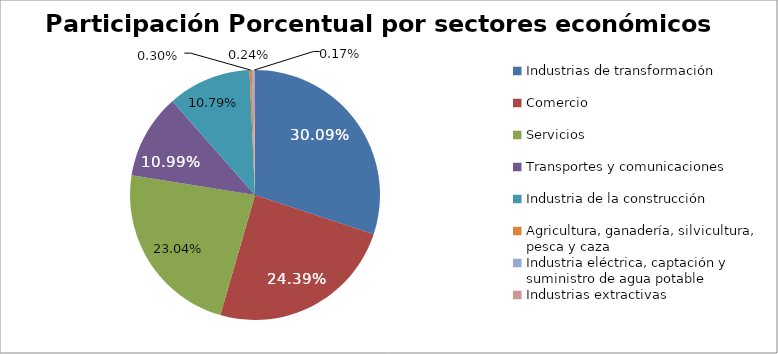
| Category | Series 0 |
|---|---|
| Industrias de transformación | 32840 |
| Comercio | 26617 |
| Servicios | 25151 |
| Transportes y comunicaciones | 11991 |
| Industria de la construcción | 11778 |
| Agricultura, ganadería, silvicultura, pesca y caza | 330 |
| Industria eléctrica, captación y suministro de agua potable | 259 |
| Industrias extractivas | 179 |